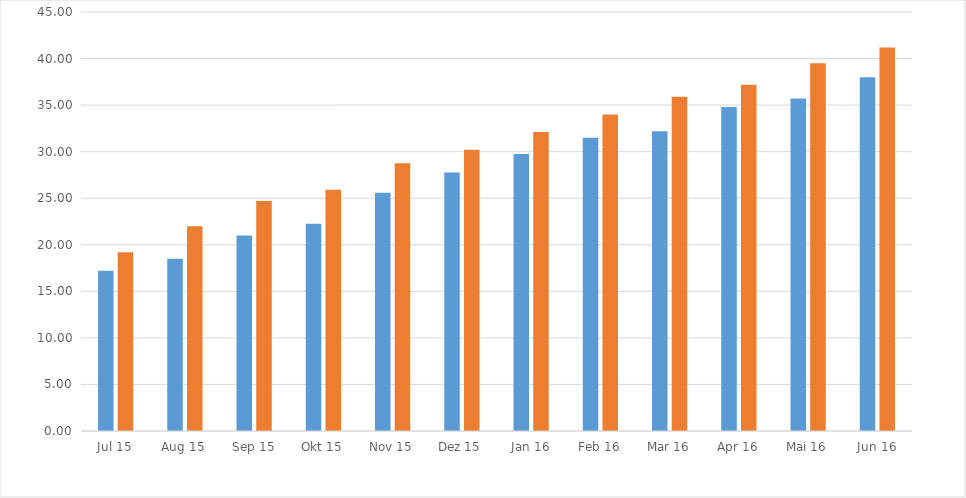
| Category | Jul 15 |
|---|---|
| Jul 15 | 19.2 |
| Aug 15 | 22 |
| Sep 15 | 24.7 |
| Okt 15 | 25.9 |
| Nov 15 | 28.75 |
| Dez 15 | 30.2 |
| Jan 16 | 32.1 |
| Feb 16 | 34 |
| Mar 16 | 35.9 |
| Apr 16 | 37.2 |
| Mai 16 | 39.5 |
| Jun 16 | 41.2 |